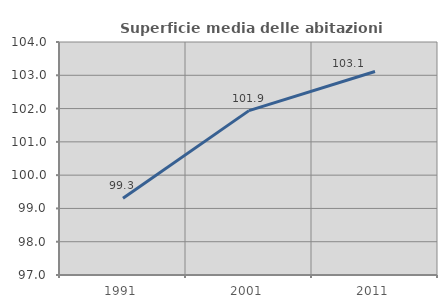
| Category | Superficie media delle abitazioni occupate |
|---|---|
| 1991.0 | 99.308 |
| 2001.0 | 101.938 |
| 2011.0 | 103.113 |